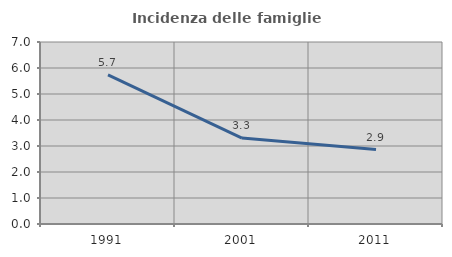
| Category | Incidenza delle famiglie numerose |
|---|---|
| 1991.0 | 5.732 |
| 2001.0 | 3.307 |
| 2011.0 | 2.863 |